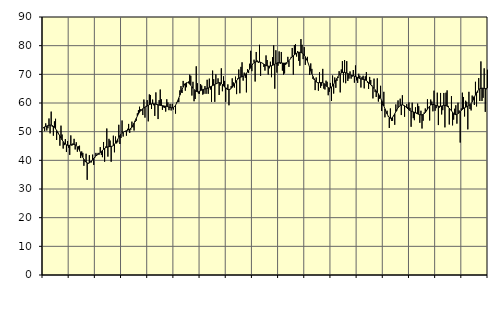
| Category | Piggar | Series 1 |
|---|---|---|
| nan | 51.5 | 51.23 |
| 87.0 | 50.2 | 51.69 |
| 87.0 | 52.9 | 51.83 |
| 87.0 | 50.4 | 51.97 |
| 87.0 | 51.2 | 52.1 |
| 87.0 | 54.6 | 52.25 |
| 87.0 | 49.4 | 52.32 |
| 87.0 | 57 | 52.28 |
| 87.0 | 51.7 | 52.15 |
| 87.0 | 48.6 | 51.9 |
| 87.0 | 53.6 | 51.52 |
| 87.0 | 54.5 | 51.02 |
| nan | 47.1 | 50.42 |
| 88.0 | 49.5 | 49.79 |
| 88.0 | 49.2 | 49.12 |
| 88.0 | 45.1 | 48.44 |
| 88.0 | 52.1 | 47.78 |
| 88.0 | 49 | 47.13 |
| 88.0 | 44.1 | 46.55 |
| 88.0 | 45.3 | 46.05 |
| 88.0 | 47.4 | 45.65 |
| 88.0 | 42.9 | 45.4 |
| 88.0 | 46.7 | 45.26 |
| 88.0 | 44.4 | 45.21 |
| nan | 41.9 | 45.26 |
| 89.0 | 48.7 | 45.37 |
| 89.0 | 45.1 | 45.49 |
| 89.0 | 45.9 | 45.58 |
| 89.0 | 47.5 | 45.56 |
| 89.0 | 43.8 | 45.42 |
| 89.0 | 46.3 | 45.14 |
| 89.0 | 43 | 44.71 |
| 89.0 | 44.9 | 44.13 |
| 89.0 | 45.1 | 43.42 |
| 89.0 | 40.8 | 42.62 |
| 89.0 | 43.1 | 41.81 |
| nan | 42.6 | 41.04 |
| 90.0 | 38.1 | 40.36 |
| 90.0 | 39.6 | 39.78 |
| 90.0 | 42.3 | 39.35 |
| 90.0 | 33.2 | 39.09 |
| 90.0 | 38.8 | 39.01 |
| 90.0 | 41.8 | 39.11 |
| 90.0 | 39.6 | 39.38 |
| 90.0 | 39.3 | 39.75 |
| 90.0 | 42 | 40.21 |
| 90.0 | 38.4 | 40.69 |
| 90.0 | 40.9 | 41.12 |
| nan | 42.6 | 41.5 |
| 91.0 | 42 | 41.82 |
| 91.0 | 42.6 | 42.1 |
| 91.0 | 42 | 42.39 |
| 91.0 | 44.6 | 42.72 |
| 91.0 | 41.9 | 43.1 |
| 91.0 | 41.1 | 43.49 |
| 91.0 | 46.4 | 43.84 |
| 91.0 | 39.5 | 44.15 |
| 91.0 | 44.8 | 44.41 |
| 91.0 | 51.1 | 44.58 |
| 91.0 | 41.3 | 44.7 |
| nan | 47.5 | 44.77 |
| 92.0 | 46.9 | 44.8 |
| 92.0 | 39.5 | 44.85 |
| 92.0 | 45 | 44.96 |
| 92.0 | 48.6 | 45.18 |
| 92.0 | 42.8 | 45.54 |
| 92.0 | 48.3 | 46.06 |
| 92.0 | 45.9 | 46.67 |
| 92.0 | 46.3 | 47.34 |
| 92.0 | 52.4 | 48.02 |
| 92.0 | 45.7 | 48.62 |
| 92.0 | 47.8 | 49.1 |
| nan | 53.9 | 49.49 |
| 93.0 | 48.3 | 49.78 |
| 93.0 | 50 | 50.01 |
| 93.0 | 50 | 50.2 |
| 93.0 | 48.6 | 50.34 |
| 93.0 | 51 | 50.47 |
| 93.0 | 52.7 | 50.62 |
| 93.0 | 49.6 | 50.84 |
| 93.0 | 50.7 | 51.18 |
| 93.0 | 53.5 | 51.65 |
| 93.0 | 51.5 | 52.25 |
| 93.0 | 50.4 | 52.99 |
| nan | 53.4 | 53.79 |
| 94.0 | 53.8 | 54.62 |
| 94.0 | 56.4 | 55.44 |
| 94.0 | 57.5 | 56.17 |
| 94.0 | 58.7 | 56.8 |
| 94.0 | 57.8 | 57.31 |
| 94.0 | 57.4 | 57.69 |
| 94.0 | 55.8 | 58 |
| 94.0 | 61.2 | 58.25 |
| 94.0 | 54.9 | 58.47 |
| 94.0 | 59 | 58.7 |
| 94.0 | 61 | 58.96 |
| nan | 53.6 | 59.21 |
| 95.0 | 63 | 59.42 |
| 95.0 | 62.8 | 59.59 |
| 95.0 | 57.9 | 59.7 |
| 95.0 | 61.2 | 59.75 |
| 95.0 | 59.2 | 59.74 |
| 95.0 | 55.5 | 59.69 |
| 95.0 | 63.7 | 59.6 |
| 95.0 | 59.3 | 59.48 |
| 95.0 | 54.4 | 59.35 |
| 95.0 | 61 | 59.25 |
| 95.0 | 64.7 | 59.17 |
| nan | 61.3 | 59.11 |
| 96.0 | 57.6 | 59.07 |
| 96.0 | 58.5 | 59.01 |
| 96.0 | 58.3 | 58.95 |
| 96.0 | 57 | 58.89 |
| 96.0 | 61.3 | 58.81 |
| 96.0 | 60.2 | 58.71 |
| 96.0 | 57.5 | 58.59 |
| 96.0 | 59.7 | 58.45 |
| 96.0 | 57.4 | 58.36 |
| 96.0 | 59.7 | 58.34 |
| 96.0 | 57.7 | 58.44 |
| nan | 58.8 | 58.71 |
| 97.0 | 56.3 | 59.21 |
| 97.0 | 60.2 | 59.92 |
| 97.0 | 60.5 | 60.79 |
| 97.0 | 60.3 | 61.75 |
| 97.0 | 64.4 | 62.76 |
| 97.0 | 65.9 | 63.75 |
| 97.0 | 63.5 | 64.68 |
| 97.0 | 67.7 | 65.55 |
| 97.0 | 66.7 | 66.26 |
| 97.0 | 64.3 | 66.78 |
| 97.0 | 65.5 | 67.05 |
| nan | 67.1 | 67.11 |
| 98.0 | 67.5 | 66.95 |
| 98.0 | 69.9 | 66.62 |
| 98.0 | 69.5 | 66.17 |
| 98.0 | 62.6 | 65.66 |
| 98.0 | 67.4 | 65.16 |
| 98.0 | 60.6 | 64.7 |
| 98.0 | 61.4 | 64.31 |
| 98.0 | 72.8 | 64.06 |
| 98.0 | 66.9 | 63.92 |
| 98.0 | 63.3 | 63.93 |
| 98.0 | 63.2 | 64.08 |
| nan | 66.6 | 64.3 |
| 99.0 | 66.1 | 64.5 |
| 99.0 | 62.9 | 64.67 |
| 99.0 | 63.2 | 64.79 |
| 99.0 | 65.9 | 64.88 |
| 99.0 | 63.2 | 64.96 |
| 99.0 | 68.1 | 65.08 |
| 99.0 | 63.2 | 65.27 |
| 99.0 | 68.5 | 65.47 |
| 99.0 | 64.7 | 65.68 |
| 99.0 | 60.4 | 65.86 |
| 99.0 | 71.3 | 66.04 |
| nan | 68.3 | 66.23 |
| 0.0 | 60.4 | 66.43 |
| 0.0 | 70 | 66.63 |
| 0.0 | 66.8 | 66.84 |
| 0.0 | 68.6 | 67.02 |
| 0.0 | 62.8 | 67.11 |
| 0.0 | 66.1 | 67.05 |
| 0.0 | 72.1 | 66.82 |
| 0.0 | 64.1 | 66.47 |
| 0.0 | 69.3 | 66.02 |
| 0.0 | 67.7 | 65.58 |
| 0.0 | 60.4 | 65.19 |
| nan | 65.3 | 64.87 |
| 1.0 | 66.5 | 64.69 |
| 1.0 | 59.2 | 64.69 |
| 1.0 | 64.7 | 64.82 |
| 1.0 | 65.9 | 65.09 |
| 1.0 | 68.6 | 65.49 |
| 1.0 | 67.2 | 66.02 |
| 1.0 | 65.4 | 66.62 |
| 1.0 | 69.2 | 67.23 |
| 1.0 | 63.1 | 67.8 |
| 1.0 | 68.6 | 68.27 |
| 1.0 | 71.7 | 68.61 |
| nan | 63.4 | 68.86 |
| 2.0 | 72.6 | 69.04 |
| 2.0 | 74.2 | 69.2 |
| 2.0 | 67.8 | 69.42 |
| 2.0 | 70.6 | 69.69 |
| 2.0 | 68.8 | 70.01 |
| 2.0 | 63.7 | 70.38 |
| 2.0 | 71.8 | 70.81 |
| 2.0 | 70.5 | 71.31 |
| 2.0 | 73.7 | 71.88 |
| 2.0 | 78.2 | 72.51 |
| 2.0 | 71.1 | 73.11 |
| nan | 73.6 | 73.66 |
| 3.0 | 75.1 | 74.09 |
| 3.0 | 67.5 | 74.33 |
| 3.0 | 77.8 | 74.41 |
| 3.0 | 74.8 | 74.41 |
| 3.0 | 74 | 74.35 |
| 3.0 | 80.3 | 74.28 |
| 3.0 | 69.5 | 74.2 |
| 3.0 | 74.1 | 74.03 |
| 3.0 | 73.9 | 73.81 |
| 3.0 | 72.6 | 73.54 |
| 3.0 | 71.3 | 73.27 |
| nan | 76.6 | 73.07 |
| 4.0 | 75 | 72.93 |
| 4.0 | 69.9 | 72.86 |
| 4.0 | 72.1 | 72.85 |
| 4.0 | 74.4 | 72.88 |
| 4.0 | 69 | 72.98 |
| 4.0 | 76 | 73.14 |
| 4.0 | 80.1 | 73.32 |
| 4.0 | 65 | 73.55 |
| 4.0 | 78.4 | 73.76 |
| 4.0 | 70.6 | 73.94 |
| 4.0 | 73 | 74.07 |
| nan | 78 | 74.12 |
| 5.0 | 73.6 | 74.07 |
| 5.0 | 77.8 | 74 |
| 5.0 | 71.3 | 73.95 |
| 5.0 | 69.9 | 73.9 |
| 5.0 | 70.3 | 73.89 |
| 5.0 | 73.3 | 73.96 |
| 5.0 | 73.7 | 74.1 |
| 5.0 | 76.1 | 74.39 |
| 5.0 | 72.6 | 74.8 |
| 5.0 | 75.3 | 75.24 |
| 5.0 | 76.1 | 75.71 |
| nan | 79.2 | 76.12 |
| 6.0 | 69.9 | 76.49 |
| 6.0 | 80.2 | 76.81 |
| 6.0 | 80.5 | 77.09 |
| 6.0 | 76.2 | 77.34 |
| 6.0 | 78.1 | 77.55 |
| 6.0 | 74.7 | 77.67 |
| 6.0 | 73 | 77.7 |
| 6.0 | 82.3 | 77.63 |
| 6.0 | 80.3 | 77.44 |
| 6.0 | 75.3 | 77.15 |
| 6.0 | 79.5 | 76.73 |
| nan | 73.3 | 76.14 |
| 7.0 | 75 | 75.41 |
| 7.0 | 76.1 | 74.53 |
| 7.0 | 73.6 | 73.5 |
| 7.0 | 69.8 | 72.39 |
| 7.0 | 73.8 | 71.27 |
| 7.0 | 71.9 | 70.2 |
| 7.0 | 68.4 | 69.26 |
| 7.0 | 68.1 | 68.48 |
| 7.0 | 64.5 | 67.83 |
| 7.0 | 68.9 | 67.39 |
| 7.0 | 67 | 67.14 |
| nan | 64.3 | 67.05 |
| 8.0 | 70.7 | 67.09 |
| 8.0 | 65.3 | 67.14 |
| 8.0 | 66 | 67.16 |
| 8.0 | 71.9 | 67.07 |
| 8.0 | 65 | 66.85 |
| 8.0 | 64.7 | 66.49 |
| 8.0 | 67.8 | 66.06 |
| 8.0 | 67.4 | 65.65 |
| 8.0 | 62.7 | 65.35 |
| 8.0 | 63.9 | 65.22 |
| 8.0 | 67 | 65.27 |
| nan | 60.7 | 65.53 |
| 9.0 | 69.6 | 65.97 |
| 9.0 | 63.3 | 66.54 |
| 9.0 | 68.9 | 67.21 |
| 9.0 | 65.3 | 67.91 |
| 9.0 | 67.7 | 68.58 |
| 9.0 | 68.7 | 69.21 |
| 9.0 | 71.1 | 69.75 |
| 9.0 | 63.7 | 70.16 |
| 9.0 | 71.7 | 70.45 |
| 9.0 | 74.6 | 70.63 |
| 9.0 | 67.2 | 70.69 |
| nan | 75 | 70.66 |
| 10.0 | 66.9 | 70.57 |
| 10.0 | 74.6 | 70.43 |
| 10.0 | 67.7 | 70.26 |
| 10.0 | 68.5 | 70.07 |
| 10.0 | 71 | 69.89 |
| 10.0 | 68.5 | 69.72 |
| 10.0 | 69.2 | 69.59 |
| 10.0 | 71.5 | 69.48 |
| 10.0 | 67.1 | 69.38 |
| 10.0 | 73.1 | 69.23 |
| 10.0 | 67.9 | 69.07 |
| nan | 67 | 68.9 |
| 11.0 | 70.2 | 68.72 |
| 11.0 | 69.5 | 68.56 |
| 11.0 | 65.4 | 68.43 |
| 11.0 | 69.1 | 68.33 |
| 11.0 | 69.5 | 68.24 |
| 11.0 | 65.1 | 68.15 |
| 11.0 | 69.3 | 68 |
| 11.0 | 70.8 | 67.8 |
| 11.0 | 67.1 | 67.52 |
| 11.0 | 64.9 | 67.18 |
| 11.0 | 69.1 | 66.77 |
| nan | 68 | 66.36 |
| 12.0 | 66.2 | 65.93 |
| 12.0 | 61.6 | 65.49 |
| 12.0 | 68.5 | 65.06 |
| 12.0 | 63.8 | 64.64 |
| 12.0 | 62.1 | 64.2 |
| 12.0 | 68.6 | 63.73 |
| 12.0 | 60.5 | 63.18 |
| 12.0 | 61.5 | 62.52 |
| 12.0 | 66 | 61.75 |
| 12.0 | 57.2 | 60.88 |
| 12.0 | 59.2 | 59.95 |
| nan | 63.9 | 58.97 |
| 13.0 | 55 | 57.98 |
| 13.0 | 57 | 57.02 |
| 13.0 | 57.3 | 56.16 |
| 13.0 | 55.3 | 55.44 |
| 13.0 | 51.3 | 54.94 |
| 13.0 | 58.1 | 54.7 |
| 13.0 | 53.8 | 54.71 |
| 13.0 | 53.8 | 55.01 |
| 13.0 | 55.7 | 55.54 |
| 13.0 | 52.4 | 56.23 |
| 13.0 | 59.5 | 56.99 |
| nan | 57.4 | 57.72 |
| 14.0 | 60.9 | 58.32 |
| 14.0 | 58.7 | 58.82 |
| 14.0 | 61.5 | 59.16 |
| 14.0 | 55.8 | 59.33 |
| 14.0 | 62.7 | 59.36 |
| 14.0 | 59.1 | 59.26 |
| 14.0 | 55.2 | 59.03 |
| 14.0 | 58.6 | 58.7 |
| 14.0 | 59.6 | 58.33 |
| 14.0 | 58.6 | 57.95 |
| 14.0 | 60.2 | 57.62 |
| nan | 58.3 | 57.34 |
| 15.0 | 51.7 | 57.15 |
| 15.0 | 60.1 | 57.01 |
| 15.0 | 54.7 | 56.89 |
| 15.0 | 54 | 56.76 |
| 15.0 | 58.5 | 56.59 |
| 15.0 | 56.6 | 56.38 |
| 15.0 | 59.8 | 56.2 |
| 15.0 | 58.9 | 56.05 |
| 15.0 | 53.1 | 55.93 |
| 15.0 | 57.3 | 55.86 |
| 15.0 | 51.1 | 55.87 |
| nan | 53.8 | 55.98 |
| 16.0 | 56.7 | 56.25 |
| 16.0 | 58.1 | 56.67 |
| 16.0 | 57.6 | 57.2 |
| 16.0 | 61.3 | 57.83 |
| 16.0 | 58.5 | 58.43 |
| 16.0 | 53.9 | 58.93 |
| 16.0 | 61.2 | 59.29 |
| 16.0 | 60.5 | 59.45 |
| 16.0 | 57.1 | 59.5 |
| 16.0 | 64.3 | 59.45 |
| 16.0 | 57.3 | 59.31 |
| nan | 58.2 | 59.14 |
| 17.0 | 63.6 | 58.99 |
| 17.0 | 52.3 | 58.9 |
| 17.0 | 58.4 | 58.84 |
| 17.0 | 63.5 | 58.85 |
| 17.0 | 56 | 58.93 |
| 17.0 | 57.5 | 59.06 |
| 17.0 | 63.5 | 59.18 |
| 17.0 | 51.5 | 59.21 |
| 17.0 | 63.6 | 59.12 |
| 17.0 | 64.4 | 58.89 |
| 17.0 | 59 | 58.57 |
| nan | 52.5 | 58.2 |
| 18.0 | 57.7 | 57.76 |
| 18.0 | 62.4 | 57.26 |
| 18.0 | 52.2 | 56.78 |
| 18.0 | 54.2 | 56.36 |
| 18.0 | 58 | 56.05 |
| 18.0 | 59.2 | 55.95 |
| 18.0 | 52.8 | 56.03 |
| 18.0 | 60.1 | 56.27 |
| 18.0 | 57.4 | 56.63 |
| 18.0 | 46.2 | 57.01 |
| 18.0 | 58.1 | 57.38 |
| nan | 63.6 | 57.74 |
| 19.0 | 62.1 | 58.05 |
| 19.0 | 55.3 | 58.3 |
| 19.0 | 60.8 | 58.52 |
| 19.0 | 60.4 | 58.72 |
| 19.0 | 50.8 | 58.93 |
| 19.0 | 63.9 | 59.13 |
| 19.0 | 57.9 | 59.4 |
| 19.0 | 57.4 | 59.82 |
| 19.0 | 62.6 | 60.38 |
| 19.0 | 62.2 | 61.13 |
| 19.0 | 59.3 | 62.02 |
| nan | 67.4 | 62.86 |
| 20.0 | 58.8 | 63.6 |
| 20.0 | 63.6 | 64.21 |
| 20.0 | 68.7 | 64.67 |
| 20.0 | 60.7 | 64.96 |
| 20.0 | 74.5 | 65.11 |
| 20.0 | 60.7 | 65.17 |
| 20.0 | 61.8 | 65.14 |
| 20.0 | 72.1 | 65.09 |
| 20.0 | 56.9 | 65.06 |
| 20.0 | 64.8 | 65.08 |
| 20.0 | 71.6 | 65.19 |